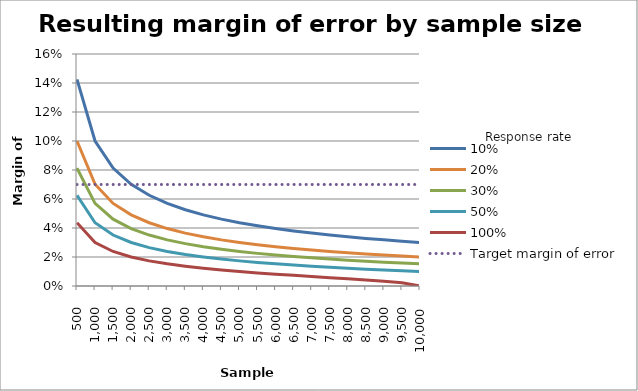
| Category | 10% | 20% | 30% | 50% | 100% | Target margin of error |
|---|---|---|---|---|---|---|
| 500.0 | 0.142 | 0.1 | 0.081 | 0.063 | 0.044 | 0.07 |
| 1000.0 | 0.1 | 0.07 | 0.057 | 0.044 | 0.03 | 0.07 |
| 1500.0 | 0.081 | 0.057 | 0.046 | 0.035 | 0.024 | 0.07 |
| 2000.0 | 0.07 | 0.049 | 0.04 | 0.03 | 0.02 | 0.07 |
| 2500.0 | 0.063 | 0.044 | 0.035 | 0.026 | 0.017 | 0.07 |
| 3000.0 | 0.057 | 0.04 | 0.032 | 0.024 | 0.015 | 0.07 |
| 3500.0 | 0.053 | 0.036 | 0.029 | 0.022 | 0.014 | 0.07 |
| 4000.0 | 0.049 | 0.034 | 0.027 | 0.02 | 0.012 | 0.07 |
| 4500.0 | 0.046 | 0.032 | 0.025 | 0.019 | 0.011 | 0.07 |
| 5000.0 | 0.044 | 0.03 | 0.024 | 0.017 | 0.01 | 0.07 |
| 5500.0 | 0.041 | 0.028 | 0.023 | 0.016 | 0.009 | 0.07 |
| 6000.0 | 0.04 | 0.027 | 0.021 | 0.015 | 0.008 | 0.07 |
| 6500.0 | 0.038 | 0.026 | 0.02 | 0.014 | 0.007 | 0.07 |
| 7000.0 | 0.036 | 0.025 | 0.019 | 0.014 | 0.007 | 0.07 |
| 7500.0 | 0.035 | 0.024 | 0.019 | 0.013 | 0.006 | 0.07 |
| 8000.0 | 0.034 | 0.023 | 0.018 | 0.012 | 0.005 | 0.07 |
| 8500.0 | 0.033 | 0.022 | 0.017 | 0.012 | 0.004 | 0.07 |
| 9000.0 | 0.032 | 0.021 | 0.016 | 0.011 | 0.003 | 0.07 |
| 9500.0 | 0.031 | 0.021 | 0.016 | 0.011 | 0.002 | 0.07 |
| 10000.0 | 0.03 | 0.02 | 0.015 | 0.01 | 0 | 0.07 |